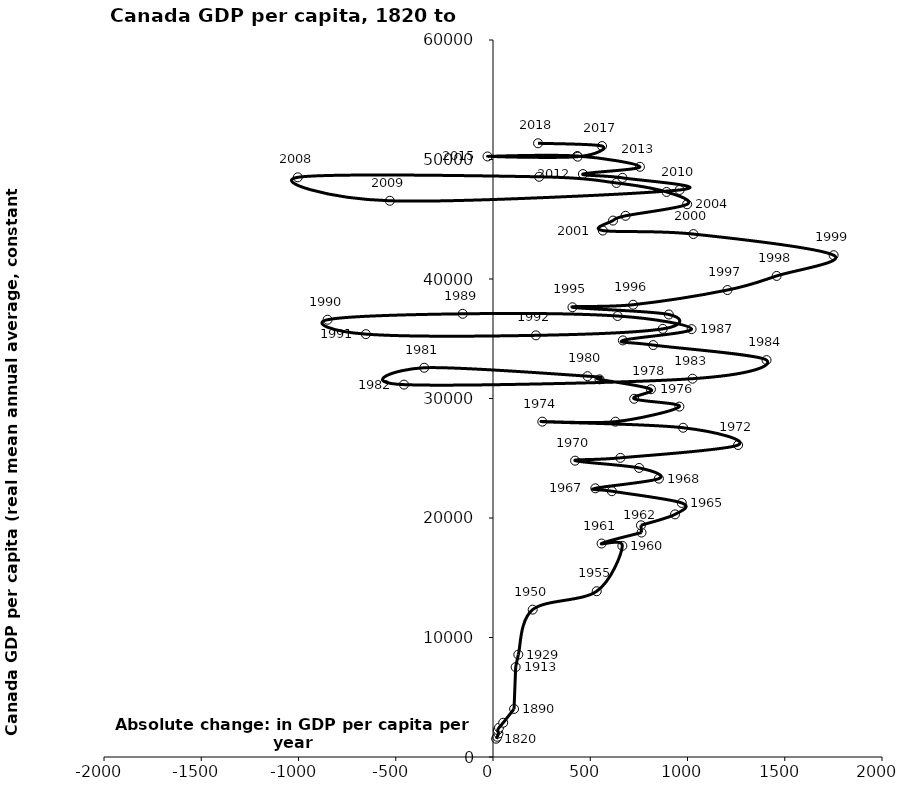
| Category | Series 0 |
|---|---|
| 16.1 | 1530 |
| 21.75 | 1691 |
| 27.9 | 1965 |
| 24.4 | 2249 |
| 30.85 | 2453 |
| 52.333333333333336 | 2866 |
| 108.25581395348837 | 4023 |
| 116.53846153846153 | 7521 |
| 130.05405405405406 | 8568 |
| 204.0 | 12333 |
| 533.2063008888824 | 13872 |
| 665.133903588001 | 17665.063 |
| 558.206783836089 | 17862.803 |
| 763.6471062103956 | 18781.477 |
| 760.5848435996977 | 19390.098 |
| 935.7834215505609 | 20302.646 |
| 970.4265441494645 | 21261.664 |
| 611.0387748596295 | 22243.499 |
| 525.9673945617706 | 22483.742 |
| 852.9297135124125 | 23295.434 |
| 751.3550323544914 | 24189.601 |
| 422.0314912509002 | 24798.144 |
| 654.9775222589706 | 25033.664 |
| 1260.0858190873296 | 26108.099 |
| 977.5381425230644 | 27553.836 |
| 253.4404420021565 | 28063.176 |
| 629.3788822803817 | 28060.717 |
| 958.2389580320032 | 29321.933 |
| 725.8035295985501 | 29977.195 |
| 812.04653562374 | 30773.54 |
| 547.6424916468404 | 31601.288 |
| 485.77885949899974 | 31868.825 |
| -353.713782399449 | 32572.846 |
| -457.64437993839783 | 31161.398 |
| 1025.9261939347562 | 31657.557 |
| 1406.3914166105405 | 33213.25 |
| 823.8767068480265 | 34470.34 |
| 667.6065966768474 | 34861.004 |
| 1021.035184091339 | 35805.553 |
| 640.634253930446 | 36903.074 |
| -155.73200083027768 | 37086.821 |
| -850.4718721479767 | 36591.61 |
| -653.6029507160165 | 35385.878 |
| 220.742180291978 | 35284.404 |
| 872.7410535497947 | 35827.362 |
| 903.9570987140069 | 37029.886 |
| 408.48483811344704 | 37635.276 |
| 720.4965246096071 | 37846.856 |
| 1205.3148542577983 | 39076.269 |
| 1458.3838252561727 | 40257.486 |
| 1751.222364678917 | 41993.037 |
| 1030.4074739643256 | 43759.93 |
| 564.5657519820197 | 44053.852 |
| 616.9782652171598 | 44889.062 |
| 681.429143335019 | 45287.808 |
| 998.0161157544389 | 46251.92 |
| 892.325516909641 | 47283.841 |
| 634.8127197534559 | 48036.571 |
| 237.37835268881463 | 48553.466 |
| -1003.7222169188826 | 48511.328 |
| -530.5046626624244 | 46546.022 |
| 959.2562518993582 | 47450.318 |
| 665.830617071224 | 48464.534 |
| 462.26149142923896 | 48781.98 |
| 755.472537098678 | 49389.057 |
| 433.25764596982117 | 50292.925 |
| -28.19485412465292 | 50255.572 |
| 435.30595211248874 | 50236.535 |
| 560.6094525166445 | 51126.184 |
| 231.56962404054502 | 51357.754 |